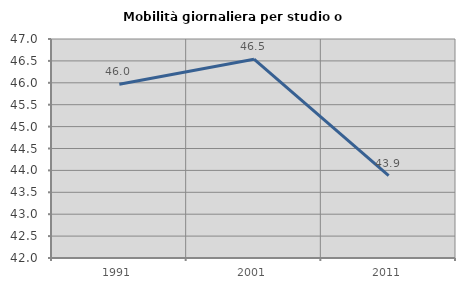
| Category | Mobilità giornaliera per studio o lavoro |
|---|---|
| 1991.0 | 45.968 |
| 2001.0 | 46.539 |
| 2011.0 | 43.881 |